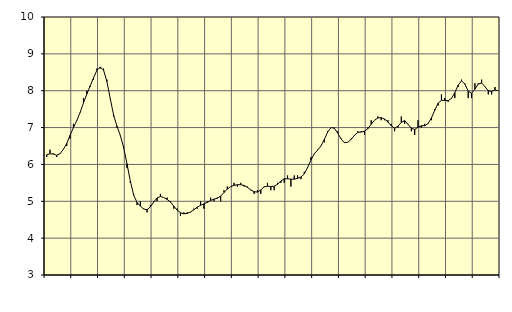
| Category | Piggar | Byggverksamhet, SNI 41-43 |
|---|---|---|
| nan | 6.2 | 6.26 |
| 87.0 | 6.4 | 6.29 |
| 87.0 | 6.3 | 6.28 |
| 87.0 | 6.2 | 6.25 |
| nan | 6.3 | 6.29 |
| 88.0 | 6.4 | 6.41 |
| 88.0 | 6.5 | 6.57 |
| 88.0 | 6.7 | 6.79 |
| nan | 7.1 | 7 |
| 89.0 | 7.2 | 7.19 |
| 89.0 | 7.4 | 7.41 |
| 89.0 | 7.8 | 7.67 |
| nan | 8 | 7.91 |
| 90.0 | 8.1 | 8.13 |
| 90.0 | 8.3 | 8.35 |
| 90.0 | 8.6 | 8.55 |
| nan | 8.6 | 8.64 |
| 91.0 | 8.6 | 8.56 |
| 91.0 | 8.3 | 8.25 |
| 91.0 | 7.8 | 7.79 |
| nan | 7.3 | 7.34 |
| 92.0 | 7 | 7.04 |
| 92.0 | 6.8 | 6.79 |
| 92.0 | 6.5 | 6.46 |
| nan | 5.9 | 6.02 |
| 93.0 | 5.5 | 5.55 |
| 93.0 | 5.2 | 5.17 |
| 93.0 | 4.9 | 4.97 |
| nan | 5 | 4.87 |
| 94.0 | 4.8 | 4.79 |
| 94.0 | 4.7 | 4.77 |
| 94.0 | 4.9 | 4.85 |
| nan | 5 | 4.98 |
| 95.0 | 5 | 5.09 |
| 95.0 | 5.2 | 5.13 |
| 95.0 | 5.1 | 5.1 |
| nan | 5.1 | 5.05 |
| 96.0 | 5 | 4.98 |
| 96.0 | 4.8 | 4.87 |
| 96.0 | 4.8 | 4.76 |
| nan | 4.6 | 4.69 |
| 97.0 | 4.7 | 4.66 |
| 97.0 | 4.7 | 4.67 |
| 97.0 | 4.7 | 4.71 |
| nan | 4.8 | 4.77 |
| 98.0 | 4.8 | 4.84 |
| 98.0 | 5 | 4.89 |
| 98.0 | 4.8 | 4.93 |
| nan | 5 | 4.97 |
| 99.0 | 5.1 | 5.02 |
| 99.0 | 5 | 5.06 |
| 99.0 | 5.1 | 5.08 |
| nan | 5 | 5.14 |
| 0.0 | 5.3 | 5.24 |
| 0.0 | 5.4 | 5.33 |
| 0.0 | 5.4 | 5.4 |
| nan | 5.5 | 5.43 |
| 1.0 | 5.4 | 5.45 |
| 1.0 | 5.5 | 5.45 |
| 1.0 | 5.4 | 5.43 |
| nan | 5.4 | 5.38 |
| 2.0 | 5.3 | 5.31 |
| 2.0 | 5.2 | 5.26 |
| 2.0 | 5.3 | 5.25 |
| nan | 5.2 | 5.31 |
| 3.0 | 5.4 | 5.39 |
| 3.0 | 5.5 | 5.41 |
| 3.0 | 5.3 | 5.4 |
| nan | 5.3 | 5.41 |
| 4.0 | 5.5 | 5.46 |
| 4.0 | 5.5 | 5.55 |
| 4.0 | 5.5 | 5.61 |
| nan | 5.7 | 5.61 |
| 5.0 | 5.4 | 5.6 |
| 5.0 | 5.7 | 5.6 |
| 5.0 | 5.7 | 5.62 |
| nan | 5.6 | 5.66 |
| 6.0 | 5.8 | 5.74 |
| 6.0 | 5.9 | 5.92 |
| 6.0 | 6.2 | 6.12 |
| nan | 6.3 | 6.29 |
| 7.0 | 6.4 | 6.39 |
| 7.0 | 6.5 | 6.5 |
| 7.0 | 6.6 | 6.68 |
| nan | 6.9 | 6.88 |
| 8.0 | 7 | 7 |
| 8.0 | 7 | 6.98 |
| 8.0 | 6.9 | 6.85 |
| nan | 6.7 | 6.69 |
| 9.0 | 6.6 | 6.59 |
| 9.0 | 6.6 | 6.6 |
| 9.0 | 6.7 | 6.68 |
| nan | 6.8 | 6.79 |
| 10.0 | 6.9 | 6.87 |
| 10.0 | 6.9 | 6.88 |
| 10.0 | 6.8 | 6.9 |
| nan | 7 | 6.97 |
| 11.0 | 7.2 | 7.09 |
| 11.0 | 7.2 | 7.2 |
| 11.0 | 7.3 | 7.26 |
| nan | 7.2 | 7.27 |
| 12.0 | 7.2 | 7.23 |
| 12.0 | 7.2 | 7.15 |
| 12.0 | 7.1 | 7.05 |
| nan | 6.9 | 6.98 |
| 13.0 | 7 | 7.04 |
| 13.0 | 7.3 | 7.14 |
| 13.0 | 7.1 | 7.19 |
| nan | 7.1 | 7.09 |
| 14.0 | 6.9 | 6.98 |
| 14.0 | 6.8 | 6.95 |
| 14.0 | 7.2 | 7.01 |
| nan | 7 | 7.05 |
| 15.0 | 7.1 | 7.05 |
| 15.0 | 7.1 | 7.11 |
| 15.0 | 7.2 | 7.26 |
| nan | 7.5 | 7.47 |
| 16.0 | 7.6 | 7.66 |
| 16.0 | 7.9 | 7.74 |
| 16.0 | 7.8 | 7.74 |
| nan | 7.7 | 7.73 |
| 17.0 | 7.8 | 7.79 |
| 17.0 | 7.8 | 7.95 |
| 17.0 | 8.1 | 8.15 |
| nan | 8.3 | 8.27 |
| 18.0 | 8.2 | 8.18 |
| 18.0 | 7.8 | 7.99 |
| 18.0 | 7.8 | 7.93 |
| nan | 8.2 | 8.04 |
| 19.0 | 8.2 | 8.18 |
| 19.0 | 8.3 | 8.21 |
| 19.0 | 8.1 | 8.11 |
| nan | 7.9 | 8 |
| 20.0 | 7.9 | 7.98 |
| 20.0 | 8.1 | 8.02 |
| 20.0 | 8 | 8 |